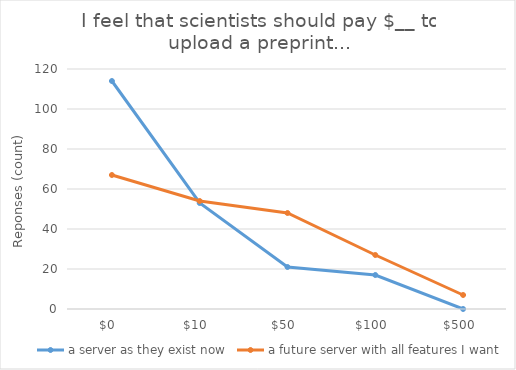
| Category | a server as they exist now | a future server with all features I want |
|---|---|---|
| 0.0 | 114 | 67 |
| 10.0 | 53 | 54 |
| 50.0 | 21 | 48 |
| 100.0 | 17 | 27 |
| 500.0 | 0 | 7 |